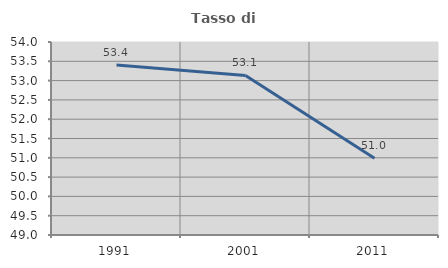
| Category | Tasso di occupazione   |
|---|---|
| 1991.0 | 53.402 |
| 2001.0 | 53.134 |
| 2011.0 | 50.988 |